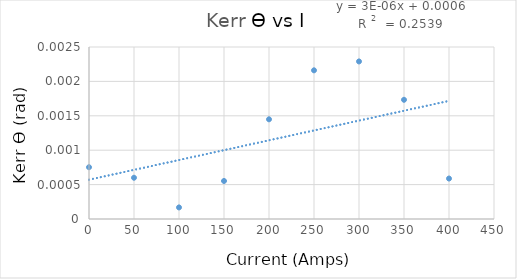
| Category | Series 0 |
|---|---|
| 0.0 | 0.001 |
| 50.0 | 0.001 |
| 100.0 | 0 |
| 150.0 | 0.001 |
| 200.0 | 0.001 |
| 250.0 | 0.002 |
| 300.0 | 0.002 |
| 350.0 | 0.002 |
| 400.0 | 0.001 |